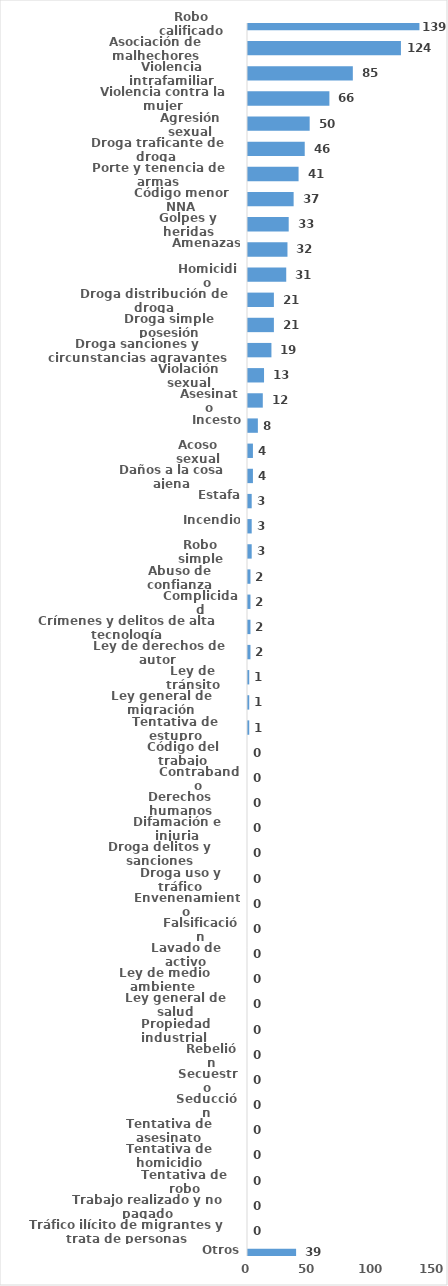
| Category | Series 0 |
|---|---|
| Robo calificado | 139 |
| Asociación de malhechores | 124 |
| Violencia intrafamiliar | 85 |
| Violencia contra la mujer | 66 |
| Agresión sexual | 50 |
| Droga traficante de droga  | 46 |
| Porte y tenencia de armas | 41 |
| Código menor NNA | 37 |
| Golpes y heridas | 33 |
| Amenazas | 32 |
| Homicidio | 31 |
| Droga distribución de droga | 21 |
| Droga simple posesión | 21 |
| Droga sanciones y circunstancias agravantes | 19 |
| Violación sexual | 13 |
| Asesinato | 12 |
| Incesto | 8 |
| Acoso sexual | 4 |
| Daños a la cosa ajena | 4 |
| Estafa | 3 |
| Incendio | 3 |
| Robo simple | 3 |
| Abuso de confianza | 2 |
| Complicidad | 2 |
| Crímenes y delitos de alta tecnología | 2 |
| Ley de derechos de autor  | 2 |
| Ley de tránsito | 1 |
| Ley general de migración | 1 |
| Tentativa de estupro | 1 |
| Código del trabajo | 0 |
| Contrabando | 0 |
| Derechos humanos | 0 |
| Difamación e injuria | 0 |
| Droga delitos y sanciones | 0 |
| Droga uso y tráfico | 0 |
| Envenenamiento | 0 |
| Falsificación | 0 |
| Lavado de activo | 0 |
| Ley de medio ambiente  | 0 |
| Ley general de salud | 0 |
| Propiedad industrial  | 0 |
| Rebelión | 0 |
| Secuestro | 0 |
| Seducción | 0 |
| Tentativa de asesinato | 0 |
| Tentativa de homicidio | 0 |
| Tentativa de robo | 0 |
| Trabajo realizado y no pagado | 0 |
| Tráfico ilícito de migrantes y trata de personas | 0 |
| Otros | 39 |